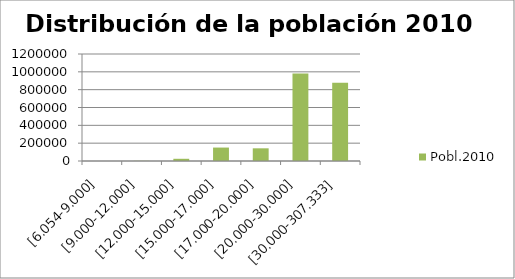
| Category | Pobl.2010 |
|---|---|
| [6.054-9.000] | 0 |
| [9.000-12.000] | 1850 |
| [12.000-15.000] | 24775 |
| [15.000-17.000] | 150680 |
| [17.000-20.000] | 142264 |
| [20.000-30.000] | 981462 |
| [30.000-307.333] | 877308 |